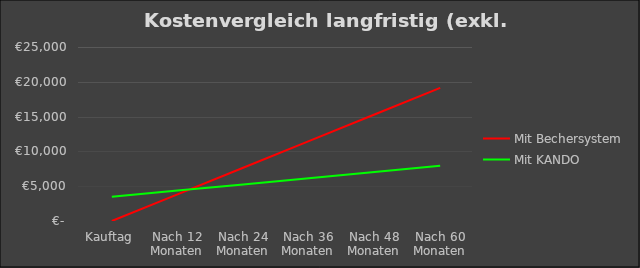
| Category | Mit Bechersystem | Mit KANDO |
|---|---|---|
| Kauftag | 0 | 3475 |
| Nach 12 Monaten | 3825 | 4366 |
| Nach 24 Monaten | 7650 | 5257 |
| Nach 36 Monaten | 11475 | 6148 |
| Nach 48 Monaten | 15300 | 7039 |
| Nach 60 Monaten | 19125 | 7930 |